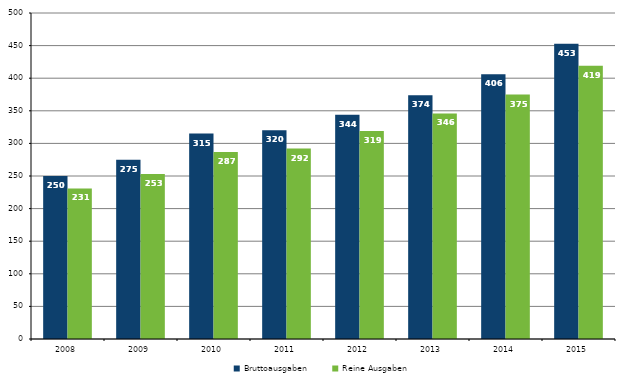
| Category | Bruttoausgaben | Reine Ausgaben |
|---|---|---|
| 2008.0 | 250 | 231 |
| 2009.0 | 275 | 253 |
| 2010.0 | 315 | 287 |
| 2011.0 | 320 | 292 |
| 2012.0 | 344 | 319 |
| 2013.0 | 374 | 346 |
| 2014.0 | 406 | 375 |
| 2015.0 | 453 | 419 |